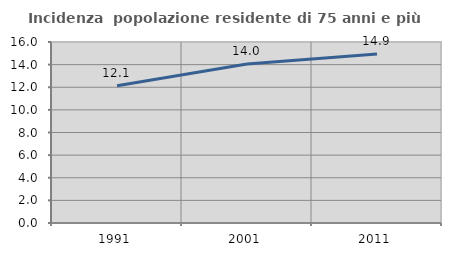
| Category | Incidenza  popolazione residente di 75 anni e più |
|---|---|
| 1991.0 | 12.129 |
| 2001.0 | 14.046 |
| 2011.0 | 14.934 |